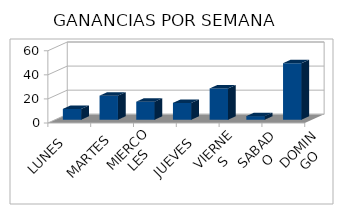
| Category | Series 0 |
|---|---|
| LUNES | 9 |
| MARTES | 20 |
| MIERCOLES | 15 |
| JUEVES  | 14 |
| VIERNES  | 26 |
| SABADO | 3 |
| DOMINGO | 47 |